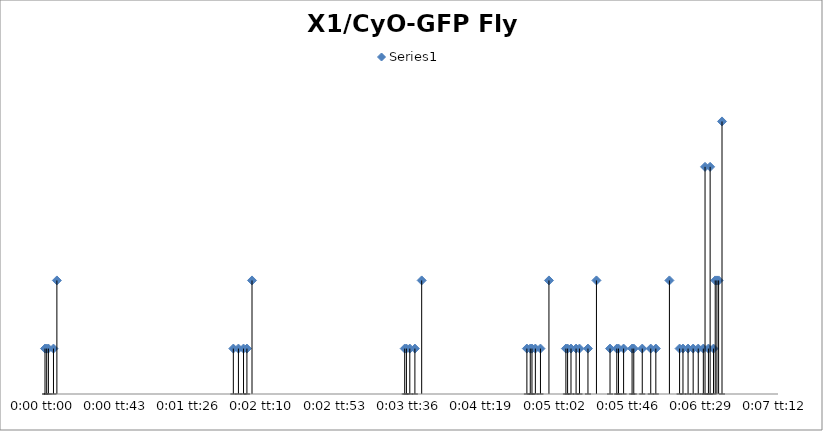
| Category | Series 0 |
|---|---|
| 0.0 | 2 |
| 1.1574074074066631e-05 | 2 |
| 2.3148148148140202e-05 | 2 |
| 5.787037037036785e-05 | 2 |
| 8.101851851850805e-05 | 5 |
| 0.0012847222222222149 | 2 |
| 0.0013194444444444356 | 2 |
| 0.0013541666666666632 | 2 |
| 0.0013773148148148034 | 2 |
| 0.001412037037037031 | 5 |
| 0.002453703703703694 | 2 |
| 0.0024652777777777746 | 2 |
| 0.0024884259259259217 | 2 |
| 0.0025231481481481424 | 2 |
| 0.0025694444444444367 | 5 |
| 0.0032870370370370328 | 2 |
| 0.00331018518518518 | 2 |
| 0.0033217592592592465 | 2 |
| 0.0033449074074074006 | 2 |
| 0.0033796296296296283 | 2 |
| 0.003437499999999989 | 5 |
| 0.0035532407407407388 | 2 |
| 0.0035648148148148054 | 2 |
| 0.0035879629629629595 | 2 |
| 0.003622685185185187 | 2 |
| 0.0036458333333333273 | 2 |
| 0.003703703703703695 | 2 |
| 0.00376157407407407 | 5 |
| 0.0038541666666666655 | 2 |
| 0.0039004629629629597 | 2 |
| 0.003912037037037026 | 2 |
| 0.003946759259259254 | 2 |
| 0.004004629629629622 | 2 |
| 0.004016203703703702 | 2 |
| 0.00407407407407407 | 2 |
| 0.004131944444444438 | 2 |
| 0.004166666666666659 | 2 |
| 0.004259259259259254 | 5 |
| 0.004328703703703703 | 2 |
| 0.004351851851851843 | 2 |
| 0.004386574074074064 | 2 |
| 0.004421296296296291 | 2 |
| 0.004456018518518512 | 2 |
| 0.00449074074074074 | 2 |
| 0.004502314814814806 | 10 |
| 0.004525462962962953 | 2 |
| 0.004537037037037034 | 10 |
| 0.004560185185185181 | 2 |
| 0.0045717592592592615 | 5 |
| 0.004583333333333328 | 5 |
| 0.004594907407407402 | 5 |
| 0.004618055555555556 | 12 |